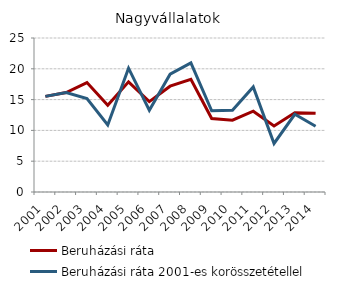
| Category | Beruházási ráta | Beruházási ráta 2001-es korösszetétellel |
|---|---|---|
| 2001.0 | 15.528 | 15.528 |
| 2002.0 | 16.145 | 16.151 |
| 2003.0 | 17.77 | 15.159 |
| 2004.0 | 14.081 | 10.883 |
| 2005.0 | 17.878 | 20.096 |
| 2006.0 | 14.669 | 13.275 |
| 2007.0 | 17.178 | 19.127 |
| 2008.0 | 18.295 | 20.97 |
| 2009.0 | 11.932 | 13.179 |
| 2010.0 | 11.653 | 13.274 |
| 2011.0 | 13.123 | 17.051 |
| 2012.0 | 10.722 | 7.874 |
| 2013.0 | 12.882 | 12.619 |
| 2014.0 | 12.787 | 10.681 |